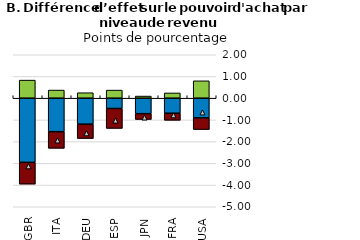
| Category | Énergie | Produits alimentaires | Autres (hors produits alimentaires et énergie) |
|---|---|---|---|
| GBR | -2.954 | -1.003 | 0.832 |
| ITA | -1.542 | -0.766 | 0.374 |
| DEU | -1.197 | -0.66 | 0.252 |
| ESP | -0.474 | -0.917 | 0.373 |
| JPN | -0.713 | -0.267 | 0.098 |
| FRA | -0.693 | -0.325 | 0.242 |
| USA | -0.906 | -0.538 | 0.8 |